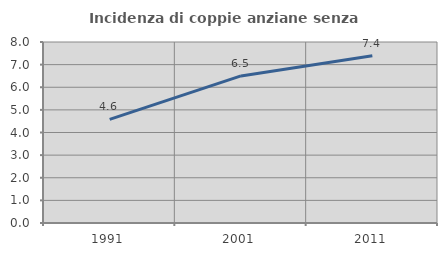
| Category | Incidenza di coppie anziane senza figli  |
|---|---|
| 1991.0 | 4.577 |
| 2001.0 | 6.502 |
| 2011.0 | 7.396 |